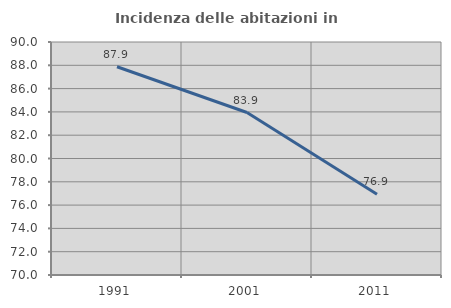
| Category | Incidenza delle abitazioni in proprietà  |
|---|---|
| 1991.0 | 87.872 |
| 2001.0 | 83.947 |
| 2011.0 | 76.923 |